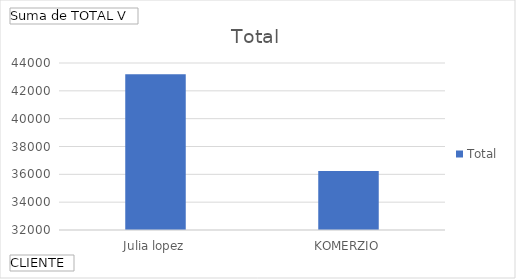
| Category | Total |
|---|---|
| Julia lopez | 43197 |
| KOMERZIO | 36235.5 |